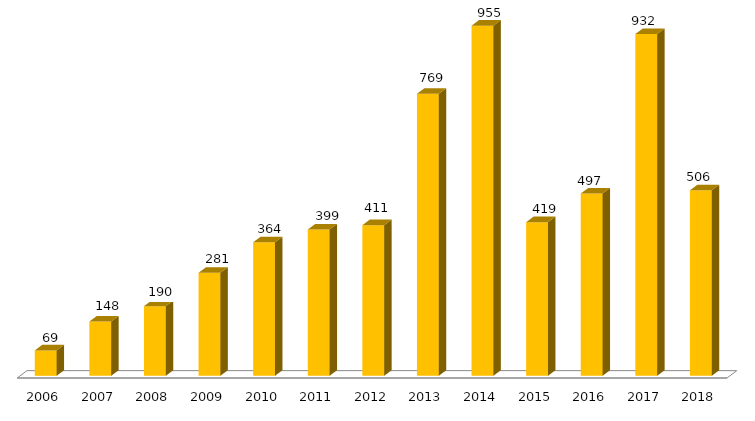
| Category | Pós - Graduação UFGD |
|---|---|
| 2006.0 | 69 |
| 2007.0 | 148 |
| 2008.0 | 190 |
| 2009.0 | 281 |
| 2010.0 | 364 |
| 2011.0 | 399 |
| 2012.0 | 411 |
| 2013.0 | 769 |
| 2014.0 | 955 |
| 2015.0 | 419 |
| 2016.0 | 497 |
| 2017.0 | 932 |
| 2018.0 | 506 |